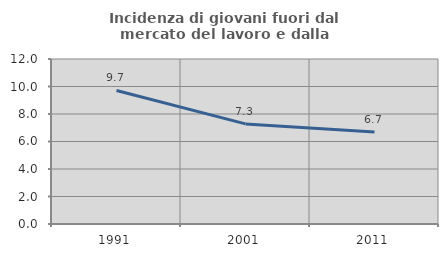
| Category | Incidenza di giovani fuori dal mercato del lavoro e dalla formazione  |
|---|---|
| 1991.0 | 9.714 |
| 2001.0 | 7.282 |
| 2011.0 | 6.695 |